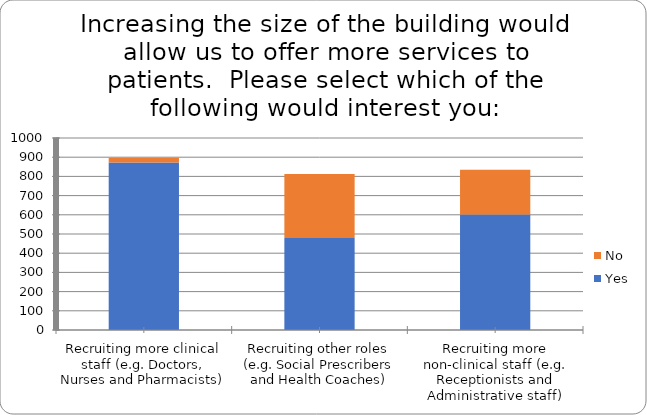
| Category | Yes | No |
|---|---|---|
| Recruiting more clinical staff (e.g. Doctors, Nurses and Pharmacists) | 872 | 25 |
| Recruiting other roles (e.g. Social Prescribers and Health Coaches) | 479 | 334 |
| Recruiting more non-clinical staff (e.g. Receptionists and Administrative staff) | 602 | 232 |